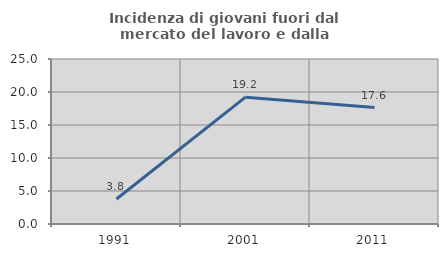
| Category | Incidenza di giovani fuori dal mercato del lavoro e dalla formazione  |
|---|---|
| 1991.0 | 3.795 |
| 2001.0 | 19.218 |
| 2011.0 | 17.647 |